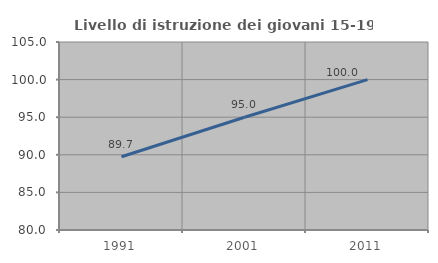
| Category | Livello di istruzione dei giovani 15-19 anni |
|---|---|
| 1991.0 | 89.744 |
| 2001.0 | 95 |
| 2011.0 | 100 |